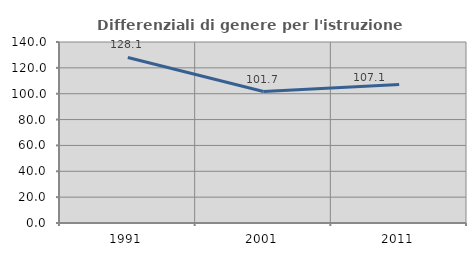
| Category | Differenziali di genere per l'istruzione superiore |
|---|---|
| 1991.0 | 128.061 |
| 2001.0 | 101.706 |
| 2011.0 | 107.06 |